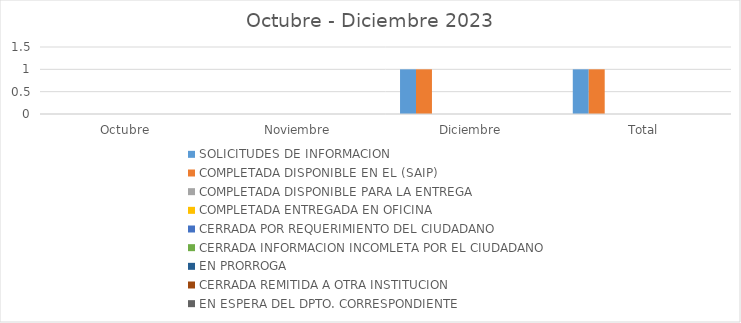
| Category | SOLICITUDES DE INFORMACION | COMPLETADA DISPONIBLE EN EL (SAIP) | COMPLETADA DISPONIBLE PARA LA ENTREGA | COMPLETADA ENTREGADA EN OFICINA | CERRADA POR REQUERIMIENTO DEL CIUDADANO | CERRADA INFORMACION INCOMLETA POR EL CIUDADANO | EN PRORROGA | CERRADA REMITIDA A OTRA INSTITUCION | EN ESPERA DEL DPTO. CORRESPONDIENTE |
|---|---|---|---|---|---|---|---|---|---|
| Octubre | 0 | 0 | 0 | 0 | 0 | 0 | 0 | 0 | 0 |
| Noviembre | 0 | 0 | 0 | 0 | 0 | 0 | 0 | 0 | 0 |
| Diciembre | 1 | 1 | 0 | 0 | 0 | 0 | 0 | 0 | 0 |
| Total | 1 | 1 | 0 | 0 | 0 | 0 | 0 | 0 | 0 |